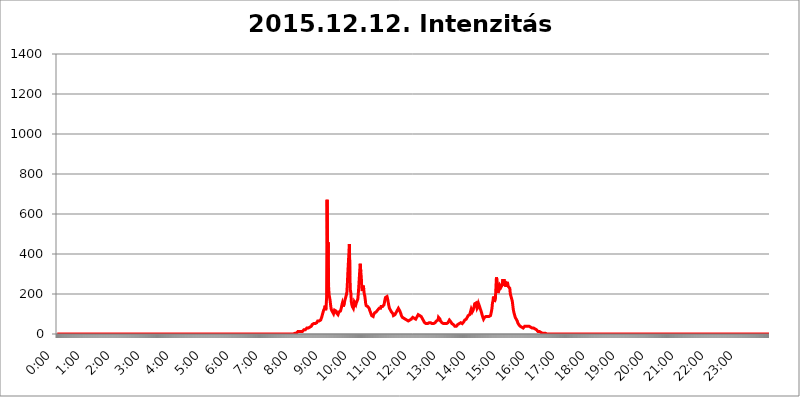
| Category | 2015.12.12. Intenzitás [W/m^2] |
|---|---|
| 0.0 | 0 |
| 0.0006944444444444445 | 0 |
| 0.001388888888888889 | 0 |
| 0.0020833333333333333 | 0 |
| 0.002777777777777778 | 0 |
| 0.003472222222222222 | 0 |
| 0.004166666666666667 | 0 |
| 0.004861111111111111 | 0 |
| 0.005555555555555556 | 0 |
| 0.0062499999999999995 | 0 |
| 0.006944444444444444 | 0 |
| 0.007638888888888889 | 0 |
| 0.008333333333333333 | 0 |
| 0.009027777777777779 | 0 |
| 0.009722222222222222 | 0 |
| 0.010416666666666666 | 0 |
| 0.011111111111111112 | 0 |
| 0.011805555555555555 | 0 |
| 0.012499999999999999 | 0 |
| 0.013194444444444444 | 0 |
| 0.013888888888888888 | 0 |
| 0.014583333333333332 | 0 |
| 0.015277777777777777 | 0 |
| 0.015972222222222224 | 0 |
| 0.016666666666666666 | 0 |
| 0.017361111111111112 | 0 |
| 0.018055555555555557 | 0 |
| 0.01875 | 0 |
| 0.019444444444444445 | 0 |
| 0.02013888888888889 | 0 |
| 0.020833333333333332 | 0 |
| 0.02152777777777778 | 0 |
| 0.022222222222222223 | 0 |
| 0.02291666666666667 | 0 |
| 0.02361111111111111 | 0 |
| 0.024305555555555556 | 0 |
| 0.024999999999999998 | 0 |
| 0.025694444444444447 | 0 |
| 0.02638888888888889 | 0 |
| 0.027083333333333334 | 0 |
| 0.027777777777777776 | 0 |
| 0.02847222222222222 | 0 |
| 0.029166666666666664 | 0 |
| 0.029861111111111113 | 0 |
| 0.030555555555555555 | 0 |
| 0.03125 | 0 |
| 0.03194444444444445 | 0 |
| 0.03263888888888889 | 0 |
| 0.03333333333333333 | 0 |
| 0.034027777777777775 | 0 |
| 0.034722222222222224 | 0 |
| 0.035416666666666666 | 0 |
| 0.036111111111111115 | 0 |
| 0.03680555555555556 | 0 |
| 0.0375 | 0 |
| 0.03819444444444444 | 0 |
| 0.03888888888888889 | 0 |
| 0.03958333333333333 | 0 |
| 0.04027777777777778 | 0 |
| 0.04097222222222222 | 0 |
| 0.041666666666666664 | 0 |
| 0.042361111111111106 | 0 |
| 0.04305555555555556 | 0 |
| 0.043750000000000004 | 0 |
| 0.044444444444444446 | 0 |
| 0.04513888888888889 | 0 |
| 0.04583333333333334 | 0 |
| 0.04652777777777778 | 0 |
| 0.04722222222222222 | 0 |
| 0.04791666666666666 | 0 |
| 0.04861111111111111 | 0 |
| 0.049305555555555554 | 0 |
| 0.049999999999999996 | 0 |
| 0.05069444444444445 | 0 |
| 0.051388888888888894 | 0 |
| 0.052083333333333336 | 0 |
| 0.05277777777777778 | 0 |
| 0.05347222222222222 | 0 |
| 0.05416666666666667 | 0 |
| 0.05486111111111111 | 0 |
| 0.05555555555555555 | 0 |
| 0.05625 | 0 |
| 0.05694444444444444 | 0 |
| 0.057638888888888885 | 0 |
| 0.05833333333333333 | 0 |
| 0.05902777777777778 | 0 |
| 0.059722222222222225 | 0 |
| 0.06041666666666667 | 0 |
| 0.061111111111111116 | 0 |
| 0.06180555555555556 | 0 |
| 0.0625 | 0 |
| 0.06319444444444444 | 0 |
| 0.06388888888888888 | 0 |
| 0.06458333333333334 | 0 |
| 0.06527777777777778 | 0 |
| 0.06597222222222222 | 0 |
| 0.06666666666666667 | 0 |
| 0.06736111111111111 | 0 |
| 0.06805555555555555 | 0 |
| 0.06874999999999999 | 0 |
| 0.06944444444444443 | 0 |
| 0.07013888888888889 | 0 |
| 0.07083333333333333 | 0 |
| 0.07152777777777779 | 0 |
| 0.07222222222222223 | 0 |
| 0.07291666666666667 | 0 |
| 0.07361111111111111 | 0 |
| 0.07430555555555556 | 0 |
| 0.075 | 0 |
| 0.07569444444444444 | 0 |
| 0.0763888888888889 | 0 |
| 0.07708333333333334 | 0 |
| 0.07777777777777778 | 0 |
| 0.07847222222222222 | 0 |
| 0.07916666666666666 | 0 |
| 0.0798611111111111 | 0 |
| 0.08055555555555556 | 0 |
| 0.08125 | 0 |
| 0.08194444444444444 | 0 |
| 0.08263888888888889 | 0 |
| 0.08333333333333333 | 0 |
| 0.08402777777777777 | 0 |
| 0.08472222222222221 | 0 |
| 0.08541666666666665 | 0 |
| 0.08611111111111112 | 0 |
| 0.08680555555555557 | 0 |
| 0.08750000000000001 | 0 |
| 0.08819444444444445 | 0 |
| 0.08888888888888889 | 0 |
| 0.08958333333333333 | 0 |
| 0.09027777777777778 | 0 |
| 0.09097222222222222 | 0 |
| 0.09166666666666667 | 0 |
| 0.09236111111111112 | 0 |
| 0.09305555555555556 | 0 |
| 0.09375 | 0 |
| 0.09444444444444444 | 0 |
| 0.09513888888888888 | 0 |
| 0.09583333333333333 | 0 |
| 0.09652777777777777 | 0 |
| 0.09722222222222222 | 0 |
| 0.09791666666666667 | 0 |
| 0.09861111111111111 | 0 |
| 0.09930555555555555 | 0 |
| 0.09999999999999999 | 0 |
| 0.10069444444444443 | 0 |
| 0.1013888888888889 | 0 |
| 0.10208333333333335 | 0 |
| 0.10277777777777779 | 0 |
| 0.10347222222222223 | 0 |
| 0.10416666666666667 | 0 |
| 0.10486111111111111 | 0 |
| 0.10555555555555556 | 0 |
| 0.10625 | 0 |
| 0.10694444444444444 | 0 |
| 0.1076388888888889 | 0 |
| 0.10833333333333334 | 0 |
| 0.10902777777777778 | 0 |
| 0.10972222222222222 | 0 |
| 0.1111111111111111 | 0 |
| 0.11180555555555556 | 0 |
| 0.11180555555555556 | 0 |
| 0.1125 | 0 |
| 0.11319444444444444 | 0 |
| 0.11388888888888889 | 0 |
| 0.11458333333333333 | 0 |
| 0.11527777777777777 | 0 |
| 0.11597222222222221 | 0 |
| 0.11666666666666665 | 0 |
| 0.1173611111111111 | 0 |
| 0.11805555555555557 | 0 |
| 0.11944444444444445 | 0 |
| 0.12013888888888889 | 0 |
| 0.12083333333333333 | 0 |
| 0.12152777777777778 | 0 |
| 0.12222222222222223 | 0 |
| 0.12291666666666667 | 0 |
| 0.12291666666666667 | 0 |
| 0.12361111111111112 | 0 |
| 0.12430555555555556 | 0 |
| 0.125 | 0 |
| 0.12569444444444444 | 0 |
| 0.12638888888888888 | 0 |
| 0.12708333333333333 | 0 |
| 0.16875 | 0 |
| 0.12847222222222224 | 0 |
| 0.12916666666666668 | 0 |
| 0.12986111111111112 | 0 |
| 0.13055555555555556 | 0 |
| 0.13125 | 0 |
| 0.13194444444444445 | 0 |
| 0.1326388888888889 | 0 |
| 0.13333333333333333 | 0 |
| 0.13402777777777777 | 0 |
| 0.13402777777777777 | 0 |
| 0.13472222222222222 | 0 |
| 0.13541666666666666 | 0 |
| 0.1361111111111111 | 0 |
| 0.13749999999999998 | 0 |
| 0.13819444444444443 | 0 |
| 0.1388888888888889 | 0 |
| 0.13958333333333334 | 0 |
| 0.14027777777777778 | 0 |
| 0.14097222222222222 | 0 |
| 0.14166666666666666 | 0 |
| 0.1423611111111111 | 0 |
| 0.14305555555555557 | 0 |
| 0.14375000000000002 | 0 |
| 0.14444444444444446 | 0 |
| 0.1451388888888889 | 0 |
| 0.1451388888888889 | 0 |
| 0.14652777777777778 | 0 |
| 0.14722222222222223 | 0 |
| 0.14791666666666667 | 0 |
| 0.1486111111111111 | 0 |
| 0.14930555555555555 | 0 |
| 0.15 | 0 |
| 0.15069444444444444 | 0 |
| 0.15138888888888888 | 0 |
| 0.15208333333333332 | 0 |
| 0.15277777777777776 | 0 |
| 0.15347222222222223 | 0 |
| 0.15416666666666667 | 0 |
| 0.15486111111111112 | 0 |
| 0.15555555555555556 | 0 |
| 0.15625 | 0 |
| 0.15694444444444444 | 0 |
| 0.15763888888888888 | 0 |
| 0.15833333333333333 | 0 |
| 0.15902777777777777 | 0 |
| 0.15972222222222224 | 0 |
| 0.16041666666666668 | 0 |
| 0.16111111111111112 | 0 |
| 0.16180555555555556 | 0 |
| 0.1625 | 0 |
| 0.16319444444444445 | 0 |
| 0.1638888888888889 | 0 |
| 0.16458333333333333 | 0 |
| 0.16527777777777777 | 0 |
| 0.16597222222222222 | 0 |
| 0.16666666666666666 | 0 |
| 0.1673611111111111 | 0 |
| 0.16805555555555554 | 0 |
| 0.16874999999999998 | 0 |
| 0.16944444444444443 | 0 |
| 0.17013888888888887 | 0 |
| 0.1708333333333333 | 0 |
| 0.17152777777777775 | 0 |
| 0.17222222222222225 | 0 |
| 0.1729166666666667 | 0 |
| 0.17361111111111113 | 0 |
| 0.17430555555555557 | 0 |
| 0.17500000000000002 | 0 |
| 0.17569444444444446 | 0 |
| 0.1763888888888889 | 0 |
| 0.17708333333333334 | 0 |
| 0.17777777777777778 | 0 |
| 0.17847222222222223 | 0 |
| 0.17916666666666667 | 0 |
| 0.1798611111111111 | 0 |
| 0.18055555555555555 | 0 |
| 0.18125 | 0 |
| 0.18194444444444444 | 0 |
| 0.1826388888888889 | 0 |
| 0.18333333333333335 | 0 |
| 0.1840277777777778 | 0 |
| 0.18472222222222223 | 0 |
| 0.18541666666666667 | 0 |
| 0.18611111111111112 | 0 |
| 0.18680555555555556 | 0 |
| 0.1875 | 0 |
| 0.18819444444444444 | 0 |
| 0.18888888888888888 | 0 |
| 0.18958333333333333 | 0 |
| 0.19027777777777777 | 0 |
| 0.1909722222222222 | 0 |
| 0.19166666666666665 | 0 |
| 0.19236111111111112 | 0 |
| 0.19305555555555554 | 0 |
| 0.19375 | 0 |
| 0.19444444444444445 | 0 |
| 0.1951388888888889 | 0 |
| 0.19583333333333333 | 0 |
| 0.19652777777777777 | 0 |
| 0.19722222222222222 | 0 |
| 0.19791666666666666 | 0 |
| 0.1986111111111111 | 0 |
| 0.19930555555555554 | 0 |
| 0.19999999999999998 | 0 |
| 0.20069444444444443 | 0 |
| 0.20138888888888887 | 0 |
| 0.2020833333333333 | 0 |
| 0.2027777777777778 | 0 |
| 0.2034722222222222 | 0 |
| 0.2041666666666667 | 0 |
| 0.20486111111111113 | 0 |
| 0.20555555555555557 | 0 |
| 0.20625000000000002 | 0 |
| 0.20694444444444446 | 0 |
| 0.2076388888888889 | 0 |
| 0.20833333333333334 | 0 |
| 0.20902777777777778 | 0 |
| 0.20972222222222223 | 0 |
| 0.21041666666666667 | 0 |
| 0.2111111111111111 | 0 |
| 0.21180555555555555 | 0 |
| 0.2125 | 0 |
| 0.21319444444444444 | 0 |
| 0.2138888888888889 | 0 |
| 0.21458333333333335 | 0 |
| 0.2152777777777778 | 0 |
| 0.21597222222222223 | 0 |
| 0.21666666666666667 | 0 |
| 0.21736111111111112 | 0 |
| 0.21805555555555556 | 0 |
| 0.21875 | 0 |
| 0.21944444444444444 | 0 |
| 0.22013888888888888 | 0 |
| 0.22083333333333333 | 0 |
| 0.22152777777777777 | 0 |
| 0.2222222222222222 | 0 |
| 0.22291666666666665 | 0 |
| 0.2236111111111111 | 0 |
| 0.22430555555555556 | 0 |
| 0.225 | 0 |
| 0.22569444444444445 | 0 |
| 0.2263888888888889 | 0 |
| 0.22708333333333333 | 0 |
| 0.22777777777777777 | 0 |
| 0.22847222222222222 | 0 |
| 0.22916666666666666 | 0 |
| 0.2298611111111111 | 0 |
| 0.23055555555555554 | 0 |
| 0.23124999999999998 | 0 |
| 0.23194444444444443 | 0 |
| 0.23263888888888887 | 0 |
| 0.2333333333333333 | 0 |
| 0.2340277777777778 | 0 |
| 0.2347222222222222 | 0 |
| 0.2354166666666667 | 0 |
| 0.23611111111111113 | 0 |
| 0.23680555555555557 | 0 |
| 0.23750000000000002 | 0 |
| 0.23819444444444446 | 0 |
| 0.2388888888888889 | 0 |
| 0.23958333333333334 | 0 |
| 0.24027777777777778 | 0 |
| 0.24097222222222223 | 0 |
| 0.24166666666666667 | 0 |
| 0.2423611111111111 | 0 |
| 0.24305555555555555 | 0 |
| 0.24375 | 0 |
| 0.24444444444444446 | 0 |
| 0.24513888888888888 | 0 |
| 0.24583333333333335 | 0 |
| 0.2465277777777778 | 0 |
| 0.24722222222222223 | 0 |
| 0.24791666666666667 | 0 |
| 0.24861111111111112 | 0 |
| 0.24930555555555556 | 0 |
| 0.25 | 0 |
| 0.25069444444444444 | 0 |
| 0.2513888888888889 | 0 |
| 0.2520833333333333 | 0 |
| 0.25277777777777777 | 0 |
| 0.2534722222222222 | 0 |
| 0.25416666666666665 | 0 |
| 0.2548611111111111 | 0 |
| 0.2555555555555556 | 0 |
| 0.25625000000000003 | 0 |
| 0.2569444444444445 | 0 |
| 0.2576388888888889 | 0 |
| 0.25833333333333336 | 0 |
| 0.2590277777777778 | 0 |
| 0.25972222222222224 | 0 |
| 0.2604166666666667 | 0 |
| 0.2611111111111111 | 0 |
| 0.26180555555555557 | 0 |
| 0.2625 | 0 |
| 0.26319444444444445 | 0 |
| 0.2638888888888889 | 0 |
| 0.26458333333333334 | 0 |
| 0.2652777777777778 | 0 |
| 0.2659722222222222 | 0 |
| 0.26666666666666666 | 0 |
| 0.2673611111111111 | 0 |
| 0.26805555555555555 | 0 |
| 0.26875 | 0 |
| 0.26944444444444443 | 0 |
| 0.2701388888888889 | 0 |
| 0.2708333333333333 | 0 |
| 0.27152777777777776 | 0 |
| 0.2722222222222222 | 0 |
| 0.27291666666666664 | 0 |
| 0.2736111111111111 | 0 |
| 0.2743055555555555 | 0 |
| 0.27499999999999997 | 0 |
| 0.27569444444444446 | 0 |
| 0.27638888888888885 | 0 |
| 0.27708333333333335 | 0 |
| 0.2777777777777778 | 0 |
| 0.27847222222222223 | 0 |
| 0.2791666666666667 | 0 |
| 0.2798611111111111 | 0 |
| 0.28055555555555556 | 0 |
| 0.28125 | 0 |
| 0.28194444444444444 | 0 |
| 0.2826388888888889 | 0 |
| 0.2833333333333333 | 0 |
| 0.28402777777777777 | 0 |
| 0.2847222222222222 | 0 |
| 0.28541666666666665 | 0 |
| 0.28611111111111115 | 0 |
| 0.28680555555555554 | 0 |
| 0.28750000000000003 | 0 |
| 0.2881944444444445 | 0 |
| 0.2888888888888889 | 0 |
| 0.28958333333333336 | 0 |
| 0.2902777777777778 | 0 |
| 0.29097222222222224 | 0 |
| 0.2916666666666667 | 0 |
| 0.2923611111111111 | 0 |
| 0.29305555555555557 | 0 |
| 0.29375 | 0 |
| 0.29444444444444445 | 0 |
| 0.2951388888888889 | 0 |
| 0.29583333333333334 | 0 |
| 0.2965277777777778 | 0 |
| 0.2972222222222222 | 0 |
| 0.29791666666666666 | 0 |
| 0.2986111111111111 | 0 |
| 0.29930555555555555 | 0 |
| 0.3 | 0 |
| 0.30069444444444443 | 0 |
| 0.3013888888888889 | 0 |
| 0.3020833333333333 | 0 |
| 0.30277777777777776 | 0 |
| 0.3034722222222222 | 0 |
| 0.30416666666666664 | 0 |
| 0.3048611111111111 | 0 |
| 0.3055555555555555 | 0 |
| 0.30624999999999997 | 0 |
| 0.3069444444444444 | 0 |
| 0.3076388888888889 | 0 |
| 0.30833333333333335 | 0 |
| 0.3090277777777778 | 0 |
| 0.30972222222222223 | 0 |
| 0.3104166666666667 | 0 |
| 0.3111111111111111 | 0 |
| 0.31180555555555556 | 0 |
| 0.3125 | 0 |
| 0.31319444444444444 | 0 |
| 0.3138888888888889 | 0 |
| 0.3145833333333333 | 0 |
| 0.31527777777777777 | 0 |
| 0.3159722222222222 | 0 |
| 0.31666666666666665 | 0 |
| 0.31736111111111115 | 0 |
| 0.31805555555555554 | 0 |
| 0.31875000000000003 | 0 |
| 0.3194444444444445 | 0 |
| 0.3201388888888889 | 0 |
| 0.32083333333333336 | 0 |
| 0.3215277777777778 | 0 |
| 0.32222222222222224 | 0 |
| 0.3229166666666667 | 0 |
| 0.3236111111111111 | 0 |
| 0.32430555555555557 | 0 |
| 0.325 | 0 |
| 0.32569444444444445 | 0 |
| 0.3263888888888889 | 0 |
| 0.32708333333333334 | 0 |
| 0.3277777777777778 | 0 |
| 0.3284722222222222 | 0 |
| 0.32916666666666666 | 0 |
| 0.3298611111111111 | 0 |
| 0.33055555555555555 | 0 |
| 0.33125 | 0 |
| 0.33194444444444443 | 0 |
| 0.3326388888888889 | 3.525 |
| 0.3333333333333333 | 3.525 |
| 0.3340277777777778 | 3.525 |
| 0.3347222222222222 | 3.525 |
| 0.3354166666666667 | 3.525 |
| 0.3361111111111111 | 7.887 |
| 0.3368055555555556 | 7.887 |
| 0.33749999999999997 | 12.257 |
| 0.33819444444444446 | 12.257 |
| 0.33888888888888885 | 12.257 |
| 0.33958333333333335 | 12.257 |
| 0.34027777777777773 | 7.887 |
| 0.34097222222222223 | 12.257 |
| 0.3416666666666666 | 12.257 |
| 0.3423611111111111 | 12.257 |
| 0.3430555555555555 | 12.257 |
| 0.34375 | 12.257 |
| 0.3444444444444445 | 16.636 |
| 0.3451388888888889 | 16.636 |
| 0.3458333333333334 | 21.024 |
| 0.34652777777777777 | 21.024 |
| 0.34722222222222227 | 21.024 |
| 0.34791666666666665 | 21.024 |
| 0.34861111111111115 | 21.024 |
| 0.34930555555555554 | 21.024 |
| 0.35000000000000003 | 29.823 |
| 0.3506944444444444 | 29.823 |
| 0.3513888888888889 | 29.823 |
| 0.3520833333333333 | 29.823 |
| 0.3527777777777778 | 29.823 |
| 0.3534722222222222 | 29.823 |
| 0.3541666666666667 | 34.234 |
| 0.3548611111111111 | 29.823 |
| 0.35555555555555557 | 34.234 |
| 0.35625 | 38.653 |
| 0.35694444444444445 | 43.079 |
| 0.3576388888888889 | 47.511 |
| 0.35833333333333334 | 47.511 |
| 0.3590277777777778 | 51.951 |
| 0.3597222222222222 | 51.951 |
| 0.36041666666666666 | 51.951 |
| 0.3611111111111111 | 51.951 |
| 0.36180555555555555 | 51.951 |
| 0.3625 | 51.951 |
| 0.36319444444444443 | 51.951 |
| 0.3638888888888889 | 56.398 |
| 0.3645833333333333 | 60.85 |
| 0.3652777777777778 | 65.31 |
| 0.3659722222222222 | 69.775 |
| 0.3666666666666667 | 69.775 |
| 0.3673611111111111 | 65.31 |
| 0.3680555555555556 | 65.31 |
| 0.36874999999999997 | 65.31 |
| 0.36944444444444446 | 69.775 |
| 0.37013888888888885 | 74.246 |
| 0.37083333333333335 | 83.205 |
| 0.37152777777777773 | 92.184 |
| 0.37222222222222223 | 101.184 |
| 0.3729166666666666 | 105.69 |
| 0.3736111111111111 | 119.235 |
| 0.3743055555555555 | 119.235 |
| 0.375 | 128.284 |
| 0.3756944444444445 | 141.884 |
| 0.3763888888888889 | 119.235 |
| 0.3770833333333334 | 132.814 |
| 0.37777777777777777 | 182.82 |
| 0.37847222222222227 | 671.22 |
| 0.37916666666666665 | 387.202 |
| 0.37986111111111115 | 458.38 |
| 0.38055555555555554 | 237.564 |
| 0.38125000000000003 | 196.497 |
| 0.3819444444444444 | 182.82 |
| 0.3826388888888889 | 169.156 |
| 0.3833333333333333 | 146.423 |
| 0.3840277777777778 | 128.284 |
| 0.3847222222222222 | 119.235 |
| 0.3854166666666667 | 114.716 |
| 0.3861111111111111 | 110.201 |
| 0.38680555555555557 | 110.201 |
| 0.3875 | 101.184 |
| 0.38819444444444445 | 110.201 |
| 0.3888888888888889 | 119.235 |
| 0.38958333333333334 | 119.235 |
| 0.3902777777777778 | 114.716 |
| 0.3909722222222222 | 114.716 |
| 0.39166666666666666 | 105.69 |
| 0.3923611111111111 | 101.184 |
| 0.39305555555555555 | 101.184 |
| 0.39375 | 96.682 |
| 0.39444444444444443 | 101.184 |
| 0.3951388888888889 | 110.201 |
| 0.3958333333333333 | 114.716 |
| 0.3965277777777778 | 114.716 |
| 0.3972222222222222 | 114.716 |
| 0.3979166666666667 | 123.758 |
| 0.3986111111111111 | 132.814 |
| 0.3993055555555556 | 146.423 |
| 0.39999999999999997 | 155.509 |
| 0.40069444444444446 | 150.964 |
| 0.40138888888888885 | 137.347 |
| 0.40208333333333335 | 132.814 |
| 0.40277777777777773 | 160.056 |
| 0.40347222222222223 | 169.156 |
| 0.4041666666666666 | 178.264 |
| 0.4048611111111111 | 182.82 |
| 0.4055555555555555 | 196.497 |
| 0.40625 | 210.182 |
| 0.4069444444444445 | 255.813 |
| 0.4076388888888889 | 310.44 |
| 0.4083333333333334 | 305.898 |
| 0.40902777777777777 | 310.44 |
| 0.40972222222222227 | 449.551 |
| 0.41041666666666665 | 292.259 |
| 0.41111111111111115 | 219.309 |
| 0.41180555555555554 | 205.62 |
| 0.41250000000000003 | 160.056 |
| 0.4131944444444444 | 146.423 |
| 0.4138888888888889 | 137.347 |
| 0.4145833333333333 | 132.814 |
| 0.4152777777777778 | 128.284 |
| 0.4159722222222222 | 141.884 |
| 0.4166666666666667 | 160.056 |
| 0.4173611111111111 | 164.605 |
| 0.41805555555555557 | 155.509 |
| 0.41875 | 146.423 |
| 0.41944444444444445 | 155.509 |
| 0.4201388888888889 | 155.509 |
| 0.42083333333333334 | 160.056 |
| 0.4215277777777778 | 173.709 |
| 0.4222222222222222 | 201.058 |
| 0.42291666666666666 | 237.564 |
| 0.4236111111111111 | 278.603 |
| 0.42430555555555555 | 319.517 |
| 0.425 | 351.198 |
| 0.42569444444444443 | 310.44 |
| 0.4263888888888889 | 287.709 |
| 0.4270833333333333 | 233 |
| 0.4277777777777778 | 214.746 |
| 0.4284722222222222 | 228.436 |
| 0.4291666666666667 | 242.127 |
| 0.4298611111111111 | 223.873 |
| 0.4305555555555556 | 201.058 |
| 0.43124999999999997 | 191.937 |
| 0.43194444444444446 | 173.709 |
| 0.43263888888888885 | 150.964 |
| 0.43333333333333335 | 141.884 |
| 0.43402777777777773 | 146.423 |
| 0.43472222222222223 | 137.347 |
| 0.4354166666666666 | 137.347 |
| 0.4361111111111111 | 137.347 |
| 0.4368055555555555 | 132.814 |
| 0.4375 | 128.284 |
| 0.4381944444444445 | 119.235 |
| 0.4388888888888889 | 114.716 |
| 0.4395833333333334 | 105.69 |
| 0.44027777777777777 | 101.184 |
| 0.44097222222222227 | 92.184 |
| 0.44166666666666665 | 87.692 |
| 0.44236111111111115 | 87.692 |
| 0.44305555555555554 | 87.692 |
| 0.44375000000000003 | 96.682 |
| 0.4444444444444444 | 101.184 |
| 0.4451388888888889 | 105.69 |
| 0.4458333333333333 | 110.201 |
| 0.4465277777777778 | 110.201 |
| 0.4472222222222222 | 110.201 |
| 0.4479166666666667 | 114.716 |
| 0.4486111111111111 | 114.716 |
| 0.44930555555555557 | 119.235 |
| 0.45 | 119.235 |
| 0.45069444444444445 | 123.758 |
| 0.4513888888888889 | 128.284 |
| 0.45208333333333334 | 128.284 |
| 0.4527777777777778 | 128.284 |
| 0.4534722222222222 | 128.284 |
| 0.45416666666666666 | 137.347 |
| 0.4548611111111111 | 137.347 |
| 0.45555555555555555 | 137.347 |
| 0.45625 | 137.347 |
| 0.45694444444444443 | 137.347 |
| 0.4576388888888889 | 141.884 |
| 0.4583333333333333 | 146.423 |
| 0.4590277777777778 | 160.056 |
| 0.4597222222222222 | 173.709 |
| 0.4604166666666667 | 182.82 |
| 0.4611111111111111 | 187.378 |
| 0.4618055555555556 | 187.378 |
| 0.46249999999999997 | 187.378 |
| 0.46319444444444446 | 178.264 |
| 0.46388888888888885 | 164.605 |
| 0.46458333333333335 | 150.964 |
| 0.46527777777777773 | 137.347 |
| 0.46597222222222223 | 128.284 |
| 0.4666666666666666 | 123.758 |
| 0.4673611111111111 | 119.235 |
| 0.4680555555555555 | 114.716 |
| 0.46875 | 110.201 |
| 0.4694444444444445 | 105.69 |
| 0.4701388888888889 | 105.69 |
| 0.4708333333333334 | 101.184 |
| 0.47152777777777777 | 92.184 |
| 0.47222222222222227 | 92.184 |
| 0.47291666666666665 | 92.184 |
| 0.47361111111111115 | 96.682 |
| 0.47430555555555554 | 101.184 |
| 0.47500000000000003 | 105.69 |
| 0.4756944444444444 | 105.69 |
| 0.4763888888888889 | 110.201 |
| 0.4770833333333333 | 119.235 |
| 0.4777777777777778 | 123.758 |
| 0.4784722222222222 | 128.284 |
| 0.4791666666666667 | 128.284 |
| 0.4798611111111111 | 123.758 |
| 0.48055555555555557 | 114.716 |
| 0.48125 | 110.201 |
| 0.48194444444444445 | 101.184 |
| 0.4826388888888889 | 92.184 |
| 0.48333333333333334 | 87.692 |
| 0.4840277777777778 | 83.205 |
| 0.4847222222222222 | 78.722 |
| 0.48541666666666666 | 78.722 |
| 0.4861111111111111 | 78.722 |
| 0.48680555555555555 | 78.722 |
| 0.4875 | 74.246 |
| 0.48819444444444443 | 74.246 |
| 0.4888888888888889 | 74.246 |
| 0.4895833333333333 | 74.246 |
| 0.4902777777777778 | 69.775 |
| 0.4909722222222222 | 69.775 |
| 0.4916666666666667 | 65.31 |
| 0.4923611111111111 | 65.31 |
| 0.4930555555555556 | 65.31 |
| 0.49374999999999997 | 69.775 |
| 0.49444444444444446 | 69.775 |
| 0.49513888888888885 | 74.246 |
| 0.49583333333333335 | 74.246 |
| 0.49652777777777773 | 74.246 |
| 0.49722222222222223 | 74.246 |
| 0.4979166666666666 | 78.722 |
| 0.4986111111111111 | 83.205 |
| 0.4993055555555555 | 83.205 |
| 0.5 | 78.722 |
| 0.5006944444444444 | 78.722 |
| 0.5013888888888889 | 78.722 |
| 0.5020833333333333 | 74.246 |
| 0.5027777777777778 | 74.246 |
| 0.5034722222222222 | 78.722 |
| 0.5041666666666667 | 83.205 |
| 0.5048611111111111 | 83.205 |
| 0.5055555555555555 | 87.692 |
| 0.50625 | 96.682 |
| 0.5069444444444444 | 96.682 |
| 0.5076388888888889 | 96.682 |
| 0.5083333333333333 | 92.184 |
| 0.5090277777777777 | 92.184 |
| 0.5097222222222222 | 87.692 |
| 0.5104166666666666 | 87.692 |
| 0.5111111111111112 | 87.692 |
| 0.5118055555555555 | 83.205 |
| 0.5125000000000001 | 74.246 |
| 0.5131944444444444 | 69.775 |
| 0.513888888888889 | 65.31 |
| 0.5145833333333333 | 60.85 |
| 0.5152777777777778 | 56.398 |
| 0.5159722222222222 | 56.398 |
| 0.5166666666666667 | 51.951 |
| 0.517361111111111 | 51.951 |
| 0.5180555555555556 | 51.951 |
| 0.5187499999999999 | 51.951 |
| 0.5194444444444445 | 51.951 |
| 0.5201388888888888 | 51.951 |
| 0.5208333333333334 | 56.398 |
| 0.5215277777777778 | 56.398 |
| 0.5222222222222223 | 56.398 |
| 0.5229166666666667 | 56.398 |
| 0.5236111111111111 | 56.398 |
| 0.5243055555555556 | 51.951 |
| 0.525 | 51.951 |
| 0.5256944444444445 | 51.951 |
| 0.5263888888888889 | 51.951 |
| 0.5270833333333333 | 51.951 |
| 0.5277777777777778 | 51.951 |
| 0.5284722222222222 | 51.951 |
| 0.5291666666666667 | 56.398 |
| 0.5298611111111111 | 56.398 |
| 0.5305555555555556 | 60.85 |
| 0.53125 | 60.85 |
| 0.5319444444444444 | 65.31 |
| 0.5326388888888889 | 65.31 |
| 0.5333333333333333 | 65.31 |
| 0.5340277777777778 | 69.775 |
| 0.5347222222222222 | 83.205 |
| 0.5354166666666667 | 83.205 |
| 0.5361111111111111 | 78.722 |
| 0.5368055555555555 | 74.246 |
| 0.5375 | 65.31 |
| 0.5381944444444444 | 65.31 |
| 0.5388888888888889 | 60.85 |
| 0.5395833333333333 | 56.398 |
| 0.5402777777777777 | 56.398 |
| 0.5409722222222222 | 51.951 |
| 0.5416666666666666 | 51.951 |
| 0.5423611111111112 | 51.951 |
| 0.5430555555555555 | 51.951 |
| 0.5437500000000001 | 51.951 |
| 0.5444444444444444 | 47.511 |
| 0.545138888888889 | 47.511 |
| 0.5458333333333333 | 51.951 |
| 0.5465277777777778 | 51.951 |
| 0.5472222222222222 | 51.951 |
| 0.5479166666666667 | 56.398 |
| 0.548611111111111 | 56.398 |
| 0.5493055555555556 | 60.85 |
| 0.5499999999999999 | 69.775 |
| 0.5506944444444445 | 74.246 |
| 0.5513888888888888 | 69.775 |
| 0.5520833333333334 | 60.85 |
| 0.5527777777777778 | 56.398 |
| 0.5534722222222223 | 51.951 |
| 0.5541666666666667 | 51.951 |
| 0.5548611111111111 | 51.951 |
| 0.5555555555555556 | 47.511 |
| 0.55625 | 47.511 |
| 0.5569444444444445 | 43.079 |
| 0.5576388888888889 | 38.653 |
| 0.5583333333333333 | 38.653 |
| 0.5590277777777778 | 38.653 |
| 0.5597222222222222 | 38.653 |
| 0.5604166666666667 | 43.079 |
| 0.5611111111111111 | 43.079 |
| 0.5618055555555556 | 47.511 |
| 0.5625 | 47.511 |
| 0.5631944444444444 | 47.511 |
| 0.5638888888888889 | 51.951 |
| 0.5645833333333333 | 51.951 |
| 0.5652777777777778 | 56.398 |
| 0.5659722222222222 | 56.398 |
| 0.5666666666666667 | 51.951 |
| 0.5673611111111111 | 51.951 |
| 0.5680555555555555 | 51.951 |
| 0.56875 | 56.398 |
| 0.5694444444444444 | 56.398 |
| 0.5701388888888889 | 60.85 |
| 0.5708333333333333 | 65.31 |
| 0.5715277777777777 | 69.775 |
| 0.5722222222222222 | 69.775 |
| 0.5729166666666666 | 74.246 |
| 0.5736111111111112 | 74.246 |
| 0.5743055555555555 | 78.722 |
| 0.5750000000000001 | 83.205 |
| 0.5756944444444444 | 87.692 |
| 0.576388888888889 | 92.184 |
| 0.5770833333333333 | 92.184 |
| 0.5777777777777778 | 92.184 |
| 0.5784722222222222 | 96.682 |
| 0.5791666666666667 | 101.184 |
| 0.579861111111111 | 114.716 |
| 0.5805555555555556 | 123.758 |
| 0.5812499999999999 | 119.235 |
| 0.5819444444444445 | 110.201 |
| 0.5826388888888888 | 110.201 |
| 0.5833333333333334 | 119.235 |
| 0.5840277777777778 | 123.758 |
| 0.5847222222222223 | 137.347 |
| 0.5854166666666667 | 150.964 |
| 0.5861111111111111 | 155.509 |
| 0.5868055555555556 | 155.509 |
| 0.5875 | 155.509 |
| 0.5881944444444445 | 141.884 |
| 0.5888888888888889 | 128.284 |
| 0.5895833333333333 | 128.284 |
| 0.5902777777777778 | 137.347 |
| 0.5909722222222222 | 150.964 |
| 0.5916666666666667 | 150.964 |
| 0.5923611111111111 | 137.347 |
| 0.5930555555555556 | 128.284 |
| 0.59375 | 123.758 |
| 0.5944444444444444 | 114.716 |
| 0.5951388888888889 | 105.69 |
| 0.5958333333333333 | 96.682 |
| 0.5965277777777778 | 87.692 |
| 0.5972222222222222 | 83.205 |
| 0.5979166666666667 | 74.246 |
| 0.5986111111111111 | 74.246 |
| 0.5993055555555555 | 83.205 |
| 0.6 | 87.692 |
| 0.6006944444444444 | 87.692 |
| 0.6013888888888889 | 87.692 |
| 0.6020833333333333 | 87.692 |
| 0.6027777777777777 | 87.692 |
| 0.6034722222222222 | 87.692 |
| 0.6041666666666666 | 87.692 |
| 0.6048611111111112 | 87.692 |
| 0.6055555555555555 | 87.692 |
| 0.6062500000000001 | 92.184 |
| 0.6069444444444444 | 92.184 |
| 0.607638888888889 | 92.184 |
| 0.6083333333333333 | 101.184 |
| 0.6090277777777778 | 114.716 |
| 0.6097222222222222 | 128.284 |
| 0.6104166666666667 | 155.509 |
| 0.611111111111111 | 164.605 |
| 0.6118055555555556 | 187.378 |
| 0.6124999999999999 | 187.378 |
| 0.6131944444444445 | 160.056 |
| 0.6138888888888888 | 160.056 |
| 0.6145833333333334 | 182.82 |
| 0.6152777777777778 | 233 |
| 0.6159722222222223 | 283.156 |
| 0.6166666666666667 | 269.49 |
| 0.6173611111111111 | 251.251 |
| 0.6180555555555556 | 205.62 |
| 0.61875 | 205.62 |
| 0.6194444444444445 | 219.309 |
| 0.6201388888888889 | 223.873 |
| 0.6208333333333333 | 242.127 |
| 0.6215277777777778 | 242.127 |
| 0.6222222222222222 | 233 |
| 0.6229166666666667 | 233 |
| 0.6236111111111111 | 242.127 |
| 0.6243055555555556 | 251.251 |
| 0.625 | 274.047 |
| 0.6256944444444444 | 242.127 |
| 0.6263888888888889 | 274.047 |
| 0.6270833333333333 | 242.127 |
| 0.6277777777777778 | 264.932 |
| 0.6284722222222222 | 260.373 |
| 0.6291666666666667 | 237.564 |
| 0.6298611111111111 | 260.373 |
| 0.6305555555555555 | 237.564 |
| 0.63125 | 260.373 |
| 0.6319444444444444 | 246.689 |
| 0.6326388888888889 | 237.564 |
| 0.6333333333333333 | 242.127 |
| 0.6340277777777777 | 242.127 |
| 0.6347222222222222 | 228.436 |
| 0.6354166666666666 | 201.058 |
| 0.6361111111111112 | 191.937 |
| 0.6368055555555555 | 182.82 |
| 0.6375000000000001 | 187.378 |
| 0.6381944444444444 | 164.605 |
| 0.638888888888889 | 164.605 |
| 0.6395833333333333 | 123.758 |
| 0.6402777777777778 | 110.201 |
| 0.6409722222222222 | 101.184 |
| 0.6416666666666667 | 92.184 |
| 0.642361111111111 | 83.205 |
| 0.6430555555555556 | 78.722 |
| 0.6437499999999999 | 74.246 |
| 0.6444444444444445 | 69.775 |
| 0.6451388888888888 | 65.31 |
| 0.6458333333333334 | 56.398 |
| 0.6465277777777778 | 51.951 |
| 0.6472222222222223 | 47.511 |
| 0.6479166666666667 | 47.511 |
| 0.6486111111111111 | 43.079 |
| 0.6493055555555556 | 38.653 |
| 0.65 | 38.653 |
| 0.6506944444444445 | 38.653 |
| 0.6513888888888889 | 34.234 |
| 0.6520833333333333 | 29.823 |
| 0.6527777777777778 | 29.823 |
| 0.6534722222222222 | 29.823 |
| 0.6541666666666667 | 29.823 |
| 0.6548611111111111 | 34.234 |
| 0.6555555555555556 | 38.653 |
| 0.65625 | 43.079 |
| 0.6569444444444444 | 43.079 |
| 0.6576388888888889 | 38.653 |
| 0.6583333333333333 | 38.653 |
| 0.6590277777777778 | 38.653 |
| 0.6597222222222222 | 38.653 |
| 0.6604166666666667 | 43.079 |
| 0.6611111111111111 | 38.653 |
| 0.6618055555555555 | 38.653 |
| 0.6625 | 34.234 |
| 0.6631944444444444 | 34.234 |
| 0.6638888888888889 | 34.234 |
| 0.6645833333333333 | 29.823 |
| 0.6652777777777777 | 34.234 |
| 0.6659722222222222 | 29.823 |
| 0.6666666666666666 | 29.823 |
| 0.6673611111111111 | 29.823 |
| 0.6680555555555556 | 29.823 |
| 0.6687500000000001 | 29.823 |
| 0.6694444444444444 | 29.823 |
| 0.6701388888888888 | 25.419 |
| 0.6708333333333334 | 25.419 |
| 0.6715277777777778 | 21.024 |
| 0.6722222222222222 | 21.024 |
| 0.6729166666666666 | 16.636 |
| 0.6736111111111112 | 16.636 |
| 0.6743055555555556 | 12.257 |
| 0.6749999999999999 | 12.257 |
| 0.6756944444444444 | 12.257 |
| 0.6763888888888889 | 12.257 |
| 0.6770833333333334 | 12.257 |
| 0.6777777777777777 | 7.887 |
| 0.6784722222222223 | 7.887 |
| 0.6791666666666667 | 7.887 |
| 0.6798611111111111 | 7.887 |
| 0.6805555555555555 | 3.525 |
| 0.68125 | 3.525 |
| 0.6819444444444445 | 3.525 |
| 0.6826388888888889 | 3.525 |
| 0.6833333333333332 | 3.525 |
| 0.6840277777777778 | 3.525 |
| 0.6847222222222222 | 3.525 |
| 0.6854166666666667 | 3.525 |
| 0.686111111111111 | 0 |
| 0.6868055555555556 | 0 |
| 0.6875 | 0 |
| 0.6881944444444444 | 0 |
| 0.688888888888889 | 0 |
| 0.6895833333333333 | 0 |
| 0.6902777777777778 | 0 |
| 0.6909722222222222 | 0 |
| 0.6916666666666668 | 0 |
| 0.6923611111111111 | 0 |
| 0.6930555555555555 | 0 |
| 0.69375 | 0 |
| 0.6944444444444445 | 0 |
| 0.6951388888888889 | 0 |
| 0.6958333333333333 | 0 |
| 0.6965277777777777 | 0 |
| 0.6972222222222223 | 0 |
| 0.6979166666666666 | 0 |
| 0.6986111111111111 | 0 |
| 0.6993055555555556 | 0 |
| 0.7000000000000001 | 0 |
| 0.7006944444444444 | 0 |
| 0.7013888888888888 | 0 |
| 0.7020833333333334 | 0 |
| 0.7027777777777778 | 0 |
| 0.7034722222222222 | 0 |
| 0.7041666666666666 | 0 |
| 0.7048611111111112 | 0 |
| 0.7055555555555556 | 0 |
| 0.7062499999999999 | 0 |
| 0.7069444444444444 | 0 |
| 0.7076388888888889 | 0 |
| 0.7083333333333334 | 0 |
| 0.7090277777777777 | 0 |
| 0.7097222222222223 | 0 |
| 0.7104166666666667 | 0 |
| 0.7111111111111111 | 0 |
| 0.7118055555555555 | 0 |
| 0.7125 | 0 |
| 0.7131944444444445 | 0 |
| 0.7138888888888889 | 0 |
| 0.7145833333333332 | 0 |
| 0.7152777777777778 | 0 |
| 0.7159722222222222 | 0 |
| 0.7166666666666667 | 0 |
| 0.717361111111111 | 0 |
| 0.7180555555555556 | 0 |
| 0.71875 | 0 |
| 0.7194444444444444 | 0 |
| 0.720138888888889 | 0 |
| 0.7208333333333333 | 0 |
| 0.7215277777777778 | 0 |
| 0.7222222222222222 | 0 |
| 0.7229166666666668 | 0 |
| 0.7236111111111111 | 0 |
| 0.7243055555555555 | 0 |
| 0.725 | 0 |
| 0.7256944444444445 | 0 |
| 0.7263888888888889 | 0 |
| 0.7270833333333333 | 0 |
| 0.7277777777777777 | 0 |
| 0.7284722222222223 | 0 |
| 0.7291666666666666 | 0 |
| 0.7298611111111111 | 0 |
| 0.7305555555555556 | 0 |
| 0.7312500000000001 | 0 |
| 0.7319444444444444 | 0 |
| 0.7326388888888888 | 0 |
| 0.7333333333333334 | 0 |
| 0.7340277777777778 | 0 |
| 0.7347222222222222 | 0 |
| 0.7354166666666666 | 0 |
| 0.7361111111111112 | 0 |
| 0.7368055555555556 | 0 |
| 0.7374999999999999 | 0 |
| 0.7381944444444444 | 0 |
| 0.7388888888888889 | 0 |
| 0.7395833333333334 | 0 |
| 0.7402777777777777 | 0 |
| 0.7409722222222223 | 0 |
| 0.7416666666666667 | 0 |
| 0.7423611111111111 | 0 |
| 0.7430555555555555 | 0 |
| 0.74375 | 0 |
| 0.7444444444444445 | 0 |
| 0.7451388888888889 | 0 |
| 0.7458333333333332 | 0 |
| 0.7465277777777778 | 0 |
| 0.7472222222222222 | 0 |
| 0.7479166666666667 | 0 |
| 0.748611111111111 | 0 |
| 0.7493055555555556 | 0 |
| 0.75 | 0 |
| 0.7506944444444444 | 0 |
| 0.751388888888889 | 0 |
| 0.7520833333333333 | 0 |
| 0.7527777777777778 | 0 |
| 0.7534722222222222 | 0 |
| 0.7541666666666668 | 0 |
| 0.7548611111111111 | 0 |
| 0.7555555555555555 | 0 |
| 0.75625 | 0 |
| 0.7569444444444445 | 0 |
| 0.7576388888888889 | 0 |
| 0.7583333333333333 | 0 |
| 0.7590277777777777 | 0 |
| 0.7597222222222223 | 0 |
| 0.7604166666666666 | 0 |
| 0.7611111111111111 | 0 |
| 0.7618055555555556 | 0 |
| 0.7625000000000001 | 0 |
| 0.7631944444444444 | 0 |
| 0.7638888888888888 | 0 |
| 0.7645833333333334 | 0 |
| 0.7652777777777778 | 0 |
| 0.7659722222222222 | 0 |
| 0.7666666666666666 | 0 |
| 0.7673611111111112 | 0 |
| 0.7680555555555556 | 0 |
| 0.7687499999999999 | 0 |
| 0.7694444444444444 | 0 |
| 0.7701388888888889 | 0 |
| 0.7708333333333334 | 0 |
| 0.7715277777777777 | 0 |
| 0.7722222222222223 | 0 |
| 0.7729166666666667 | 0 |
| 0.7736111111111111 | 0 |
| 0.7743055555555555 | 0 |
| 0.775 | 0 |
| 0.7756944444444445 | 0 |
| 0.7763888888888889 | 0 |
| 0.7770833333333332 | 0 |
| 0.7777777777777778 | 0 |
| 0.7784722222222222 | 0 |
| 0.7791666666666667 | 0 |
| 0.779861111111111 | 0 |
| 0.7805555555555556 | 0 |
| 0.78125 | 0 |
| 0.7819444444444444 | 0 |
| 0.782638888888889 | 0 |
| 0.7833333333333333 | 0 |
| 0.7840277777777778 | 0 |
| 0.7847222222222222 | 0 |
| 0.7854166666666668 | 0 |
| 0.7861111111111111 | 0 |
| 0.7868055555555555 | 0 |
| 0.7875 | 0 |
| 0.7881944444444445 | 0 |
| 0.7888888888888889 | 0 |
| 0.7895833333333333 | 0 |
| 0.7902777777777777 | 0 |
| 0.7909722222222223 | 0 |
| 0.7916666666666666 | 0 |
| 0.7923611111111111 | 0 |
| 0.7930555555555556 | 0 |
| 0.7937500000000001 | 0 |
| 0.7944444444444444 | 0 |
| 0.7951388888888888 | 0 |
| 0.7958333333333334 | 0 |
| 0.7965277777777778 | 0 |
| 0.7972222222222222 | 0 |
| 0.7979166666666666 | 0 |
| 0.7986111111111112 | 0 |
| 0.7993055555555556 | 0 |
| 0.7999999999999999 | 0 |
| 0.8006944444444444 | 0 |
| 0.8013888888888889 | 0 |
| 0.8020833333333334 | 0 |
| 0.8027777777777777 | 0 |
| 0.8034722222222223 | 0 |
| 0.8041666666666667 | 0 |
| 0.8048611111111111 | 0 |
| 0.8055555555555555 | 0 |
| 0.80625 | 0 |
| 0.8069444444444445 | 0 |
| 0.8076388888888889 | 0 |
| 0.8083333333333332 | 0 |
| 0.8090277777777778 | 0 |
| 0.8097222222222222 | 0 |
| 0.8104166666666667 | 0 |
| 0.811111111111111 | 0 |
| 0.8118055555555556 | 0 |
| 0.8125 | 0 |
| 0.8131944444444444 | 0 |
| 0.813888888888889 | 0 |
| 0.8145833333333333 | 0 |
| 0.8152777777777778 | 0 |
| 0.8159722222222222 | 0 |
| 0.8166666666666668 | 0 |
| 0.8173611111111111 | 0 |
| 0.8180555555555555 | 0 |
| 0.81875 | 0 |
| 0.8194444444444445 | 0 |
| 0.8201388888888889 | 0 |
| 0.8208333333333333 | 0 |
| 0.8215277777777777 | 0 |
| 0.8222222222222223 | 0 |
| 0.8229166666666666 | 0 |
| 0.8236111111111111 | 0 |
| 0.8243055555555556 | 0 |
| 0.8250000000000001 | 0 |
| 0.8256944444444444 | 0 |
| 0.8263888888888888 | 0 |
| 0.8270833333333334 | 0 |
| 0.8277777777777778 | 0 |
| 0.8284722222222222 | 0 |
| 0.8291666666666666 | 0 |
| 0.8298611111111112 | 0 |
| 0.8305555555555556 | 0 |
| 0.8312499999999999 | 0 |
| 0.8319444444444444 | 0 |
| 0.8326388888888889 | 0 |
| 0.8333333333333334 | 0 |
| 0.8340277777777777 | 0 |
| 0.8347222222222223 | 0 |
| 0.8354166666666667 | 0 |
| 0.8361111111111111 | 0 |
| 0.8368055555555555 | 0 |
| 0.8375 | 0 |
| 0.8381944444444445 | 0 |
| 0.8388888888888889 | 0 |
| 0.8395833333333332 | 0 |
| 0.8402777777777778 | 0 |
| 0.8409722222222222 | 0 |
| 0.8416666666666667 | 0 |
| 0.842361111111111 | 0 |
| 0.8430555555555556 | 0 |
| 0.84375 | 0 |
| 0.8444444444444444 | 0 |
| 0.845138888888889 | 0 |
| 0.8458333333333333 | 0 |
| 0.8465277777777778 | 0 |
| 0.8472222222222222 | 0 |
| 0.8479166666666668 | 0 |
| 0.8486111111111111 | 0 |
| 0.8493055555555555 | 0 |
| 0.85 | 0 |
| 0.8506944444444445 | 0 |
| 0.8513888888888889 | 0 |
| 0.8520833333333333 | 0 |
| 0.8527777777777777 | 0 |
| 0.8534722222222223 | 0 |
| 0.8541666666666666 | 0 |
| 0.8548611111111111 | 0 |
| 0.8555555555555556 | 0 |
| 0.8562500000000001 | 0 |
| 0.8569444444444444 | 0 |
| 0.8576388888888888 | 0 |
| 0.8583333333333334 | 0 |
| 0.8590277777777778 | 0 |
| 0.8597222222222222 | 0 |
| 0.8604166666666666 | 0 |
| 0.8611111111111112 | 0 |
| 0.8618055555555556 | 0 |
| 0.8624999999999999 | 0 |
| 0.8631944444444444 | 0 |
| 0.8638888888888889 | 0 |
| 0.8645833333333334 | 0 |
| 0.8652777777777777 | 0 |
| 0.8659722222222223 | 0 |
| 0.8666666666666667 | 0 |
| 0.8673611111111111 | 0 |
| 0.8680555555555555 | 0 |
| 0.86875 | 0 |
| 0.8694444444444445 | 0 |
| 0.8701388888888889 | 0 |
| 0.8708333333333332 | 0 |
| 0.8715277777777778 | 0 |
| 0.8722222222222222 | 0 |
| 0.8729166666666667 | 0 |
| 0.873611111111111 | 0 |
| 0.8743055555555556 | 0 |
| 0.875 | 0 |
| 0.8756944444444444 | 0 |
| 0.876388888888889 | 0 |
| 0.8770833333333333 | 0 |
| 0.8777777777777778 | 0 |
| 0.8784722222222222 | 0 |
| 0.8791666666666668 | 0 |
| 0.8798611111111111 | 0 |
| 0.8805555555555555 | 0 |
| 0.88125 | 0 |
| 0.8819444444444445 | 0 |
| 0.8826388888888889 | 0 |
| 0.8833333333333333 | 0 |
| 0.8840277777777777 | 0 |
| 0.8847222222222223 | 0 |
| 0.8854166666666666 | 0 |
| 0.8861111111111111 | 0 |
| 0.8868055555555556 | 0 |
| 0.8875000000000001 | 0 |
| 0.8881944444444444 | 0 |
| 0.8888888888888888 | 0 |
| 0.8895833333333334 | 0 |
| 0.8902777777777778 | 0 |
| 0.8909722222222222 | 0 |
| 0.8916666666666666 | 0 |
| 0.8923611111111112 | 0 |
| 0.8930555555555556 | 0 |
| 0.8937499999999999 | 0 |
| 0.8944444444444444 | 0 |
| 0.8951388888888889 | 0 |
| 0.8958333333333334 | 0 |
| 0.8965277777777777 | 0 |
| 0.8972222222222223 | 0 |
| 0.8979166666666667 | 0 |
| 0.8986111111111111 | 0 |
| 0.8993055555555555 | 0 |
| 0.9 | 0 |
| 0.9006944444444445 | 0 |
| 0.9013888888888889 | 0 |
| 0.9020833333333332 | 0 |
| 0.9027777777777778 | 0 |
| 0.9034722222222222 | 0 |
| 0.9041666666666667 | 0 |
| 0.904861111111111 | 0 |
| 0.9055555555555556 | 0 |
| 0.90625 | 0 |
| 0.9069444444444444 | 0 |
| 0.907638888888889 | 0 |
| 0.9083333333333333 | 0 |
| 0.9090277777777778 | 0 |
| 0.9097222222222222 | 0 |
| 0.9104166666666668 | 0 |
| 0.9111111111111111 | 0 |
| 0.9118055555555555 | 0 |
| 0.9125 | 0 |
| 0.9131944444444445 | 0 |
| 0.9138888888888889 | 0 |
| 0.9145833333333333 | 0 |
| 0.9152777777777777 | 0 |
| 0.9159722222222223 | 0 |
| 0.9166666666666666 | 0 |
| 0.9173611111111111 | 0 |
| 0.9180555555555556 | 0 |
| 0.9187500000000001 | 0 |
| 0.9194444444444444 | 0 |
| 0.9201388888888888 | 0 |
| 0.9208333333333334 | 0 |
| 0.9215277777777778 | 0 |
| 0.9222222222222222 | 0 |
| 0.9229166666666666 | 0 |
| 0.9236111111111112 | 0 |
| 0.9243055555555556 | 0 |
| 0.9249999999999999 | 0 |
| 0.9256944444444444 | 0 |
| 0.9263888888888889 | 0 |
| 0.9270833333333334 | 0 |
| 0.9277777777777777 | 0 |
| 0.9284722222222223 | 0 |
| 0.9291666666666667 | 0 |
| 0.9298611111111111 | 0 |
| 0.9305555555555555 | 0 |
| 0.93125 | 0 |
| 0.9319444444444445 | 0 |
| 0.9326388888888889 | 0 |
| 0.9333333333333332 | 0 |
| 0.9340277777777778 | 0 |
| 0.9347222222222222 | 0 |
| 0.9354166666666667 | 0 |
| 0.936111111111111 | 0 |
| 0.9368055555555556 | 0 |
| 0.9375 | 0 |
| 0.9381944444444444 | 0 |
| 0.938888888888889 | 0 |
| 0.9395833333333333 | 0 |
| 0.9402777777777778 | 0 |
| 0.9409722222222222 | 0 |
| 0.9416666666666668 | 0 |
| 0.9423611111111111 | 0 |
| 0.9430555555555555 | 0 |
| 0.94375 | 0 |
| 0.9444444444444445 | 0 |
| 0.9451388888888889 | 0 |
| 0.9458333333333333 | 0 |
| 0.9465277777777777 | 0 |
| 0.9472222222222223 | 0 |
| 0.9479166666666666 | 0 |
| 0.9486111111111111 | 0 |
| 0.9493055555555556 | 0 |
| 0.9500000000000001 | 0 |
| 0.9506944444444444 | 0 |
| 0.9513888888888888 | 0 |
| 0.9520833333333334 | 0 |
| 0.9527777777777778 | 0 |
| 0.9534722222222222 | 0 |
| 0.9541666666666666 | 0 |
| 0.9548611111111112 | 0 |
| 0.9555555555555556 | 0 |
| 0.9562499999999999 | 0 |
| 0.9569444444444444 | 0 |
| 0.9576388888888889 | 0 |
| 0.9583333333333334 | 0 |
| 0.9590277777777777 | 0 |
| 0.9597222222222223 | 0 |
| 0.9604166666666667 | 0 |
| 0.9611111111111111 | 0 |
| 0.9618055555555555 | 0 |
| 0.9625 | 0 |
| 0.9631944444444445 | 0 |
| 0.9638888888888889 | 0 |
| 0.9645833333333332 | 0 |
| 0.9652777777777778 | 0 |
| 0.9659722222222222 | 0 |
| 0.9666666666666667 | 0 |
| 0.967361111111111 | 0 |
| 0.9680555555555556 | 0 |
| 0.96875 | 0 |
| 0.9694444444444444 | 0 |
| 0.970138888888889 | 0 |
| 0.9708333333333333 | 0 |
| 0.9715277777777778 | 0 |
| 0.9722222222222222 | 0 |
| 0.9729166666666668 | 0 |
| 0.9736111111111111 | 0 |
| 0.9743055555555555 | 0 |
| 0.975 | 0 |
| 0.9756944444444445 | 0 |
| 0.9763888888888889 | 0 |
| 0.9770833333333333 | 0 |
| 0.9777777777777777 | 0 |
| 0.9784722222222223 | 0 |
| 0.9791666666666666 | 0 |
| 0.9798611111111111 | 0 |
| 0.9805555555555556 | 0 |
| 0.9812500000000001 | 0 |
| 0.9819444444444444 | 0 |
| 0.9826388888888888 | 0 |
| 0.9833333333333334 | 0 |
| 0.9840277777777778 | 0 |
| 0.9847222222222222 | 0 |
| 0.9854166666666666 | 0 |
| 0.9861111111111112 | 0 |
| 0.9868055555555556 | 0 |
| 0.9874999999999999 | 0 |
| 0.9881944444444444 | 0 |
| 0.9888888888888889 | 0 |
| 0.9895833333333334 | 0 |
| 0.9902777777777777 | 0 |
| 0.9909722222222223 | 0 |
| 0.9916666666666667 | 0 |
| 0.9923611111111111 | 0 |
| 0.9930555555555555 | 0 |
| 0.99375 | 0 |
| 0.9944444444444445 | 0 |
| 0.9951388888888889 | 0 |
| 0.9958333333333332 | 0 |
| 0.9965277777777778 | 0 |
| 0.9972222222222222 | 0 |
| 0.9979166666666667 | 0 |
| 0.998611111111111 | 0 |
| 0.9993055555555556 | 0 |